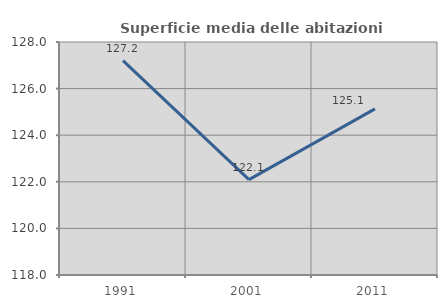
| Category | Superficie media delle abitazioni occupate |
|---|---|
| 1991.0 | 127.204 |
| 2001.0 | 122.093 |
| 2011.0 | 125.131 |